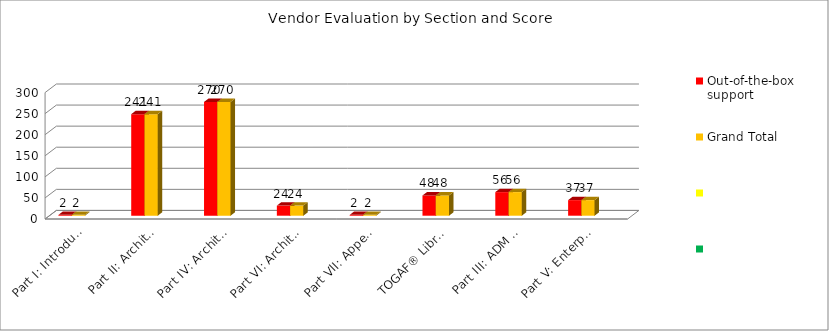
| Category | Out-of-the-box support  | Grand Total | Series 2 | Series 3 |
|---|---|---|---|---|
| Part I: Introduction | 2 | 2 |  |  |
| Part II: Architecture Development Method | 241 | 241 |  |  |
| Part IV: Architecture Content Framework | 270 | 270 |  |  |
| Part VI: Architecture Capability Framework | 24 | 24 |  |  |
| Part VII: Appendices | 2 | 2 |  |  |
| TOGAF® Library | 48 | 48 |  |  |
| Part III: ADM Guidelines & Techniques2 | 56 | 56 |  |  |
| Part V: Enterprise Continuum & Tools2 | 37 | 37 |  |  |